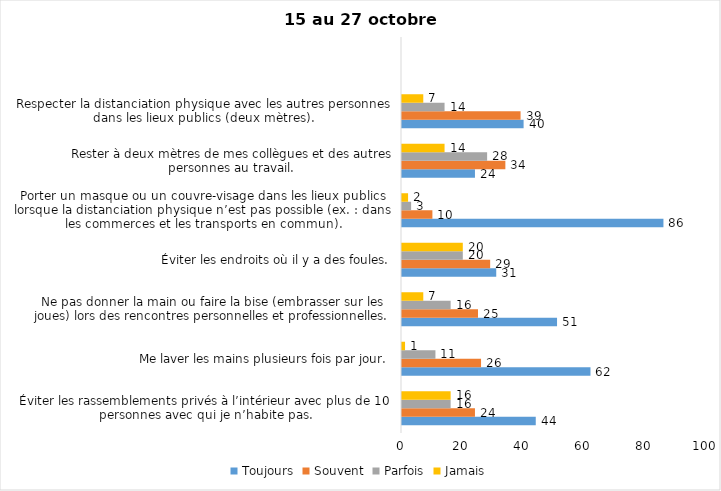
| Category | Toujours | Souvent | Parfois | Jamais |
|---|---|---|---|---|
| Éviter les rassemblements privés à l’intérieur avec plus de 10 personnes avec qui je n’habite pas. | 44 | 24 | 16 | 16 |
| Me laver les mains plusieurs fois par jour. | 62 | 26 | 11 | 1 |
| Ne pas donner la main ou faire la bise (embrasser sur les joues) lors des rencontres personnelles et professionnelles. | 51 | 25 | 16 | 7 |
| Éviter les endroits où il y a des foules. | 31 | 29 | 20 | 20 |
| Porter un masque ou un couvre-visage dans les lieux publics lorsque la distanciation physique n’est pas possible (ex. : dans les commerces et les transports en commun). | 86 | 10 | 3 | 2 |
| Rester à deux mètres de mes collègues et des autres personnes au travail. | 24 | 34 | 28 | 14 |
| Respecter la distanciation physique avec les autres personnes dans les lieux publics (deux mètres). | 40 | 39 | 14 | 7 |